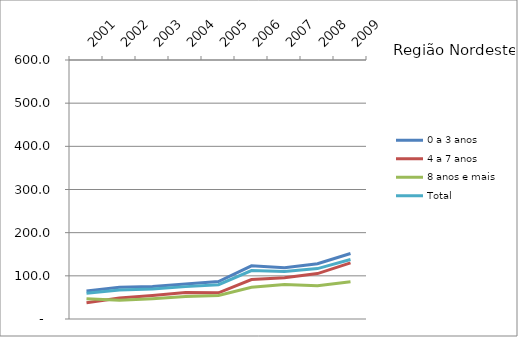
| Category | 0 a 3 anos | 4 a 7 anos | 8 anos e mais | Total |
|---|---|---|---|---|
| 2001.0 | 65.1 | 37.6 | 46.9 | 59.7 |
| 2002.0 | 73.7 | 48.5 | 43.3 | 67.2 |
| 2003.0 | 75.3 | 54.5 | 46.9 | 69.6 |
| 2004.0 | 81.1 | 61.2 | 51.9 | 75 |
| 2005.0 | 86.9 | 60.6 | 54.7 | 79.4 |
| 2006.0 | 123.3 | 91.5 | 73.3 | 112.1 |
| 2007.0 | 118.8 | 95.4 | 80.1 | 110.1 |
| 2008.0 | 128.2 | 105.2 | 76.8 | 116.8 |
| 2009.0 | 151.8 | 130.1 | 86.2 | 138 |